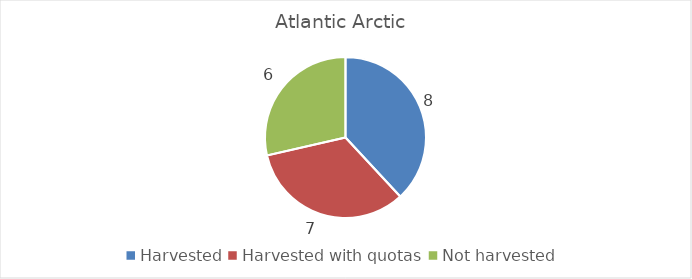
| Category | Atlantic Arctic |
|---|---|
| Harvested | 8 |
| Harvested with quotas | 7 |
| Not harvested | 6 |